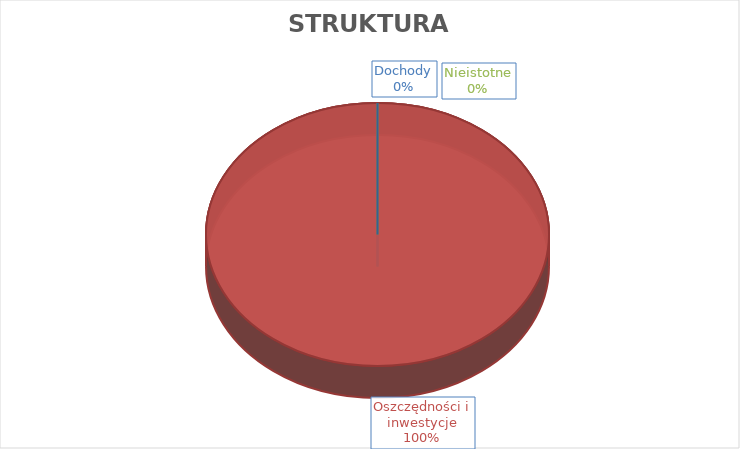
| Category | Series 0 |
|---|---|
| Dochody | 0 |
| Oszczędności i inwestycje | 10000 |
| Nieistotne | 0 |